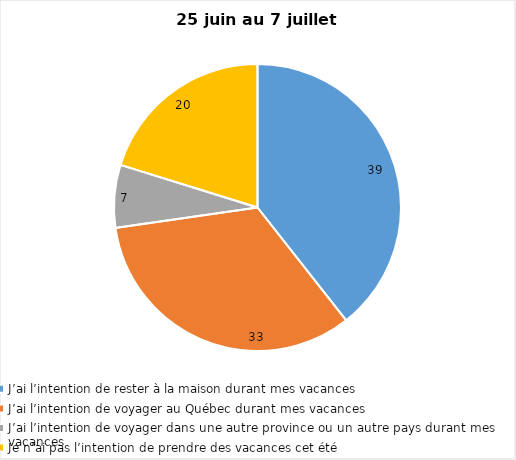
| Category | Series 0 |
|---|---|
| J’ai l’intention de rester à la maison durant mes vacances | 39 |
| J’ai l’intention de voyager au Québec durant mes vacances | 33 |
| J’ai l’intention de voyager dans une autre province ou un autre pays durant mes vacances | 7 |
| Je n’ai pas l’intention de prendre des vacances cet été | 20 |